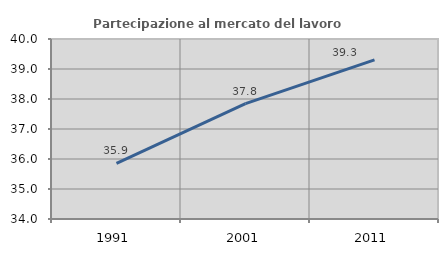
| Category | Partecipazione al mercato del lavoro  femminile |
|---|---|
| 1991.0 | 35.855 |
| 2001.0 | 37.844 |
| 2011.0 | 39.306 |